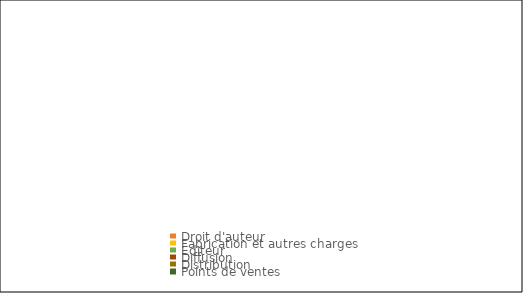
| Category | Series 0 |
|---|---|
| Droit d'auteur | 0 |
| Fabrication et autres charges | 0 |
| Editeur | 0 |
| Diffusion | 0 |
| Distribution | 0 |
| Points de ventes | 0 |